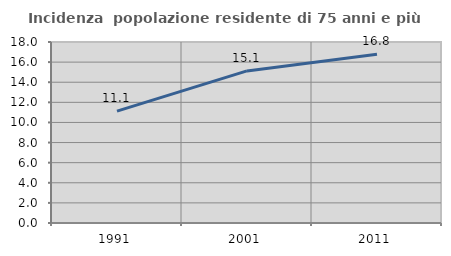
| Category | Incidenza  popolazione residente di 75 anni e più |
|---|---|
| 1991.0 | 11.119 |
| 2001.0 | 15.123 |
| 2011.0 | 16.78 |